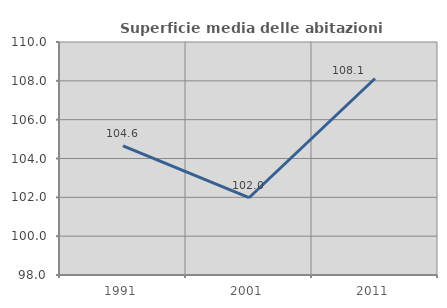
| Category | Superficie media delle abitazioni occupate |
|---|---|
| 1991.0 | 104.648 |
| 2001.0 | 101.979 |
| 2011.0 | 108.119 |